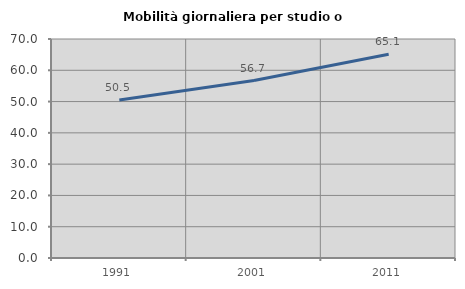
| Category | Mobilità giornaliera per studio o lavoro |
|---|---|
| 1991.0 | 50.51 |
| 2001.0 | 56.709 |
| 2011.0 | 65.122 |